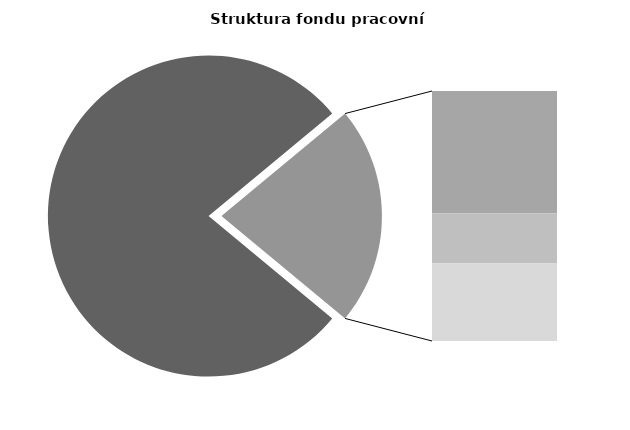
| Category | Series 0 |
|---|---|
| Průměrná měsíční odpracovaná doba bez přesčasu | 134.35 |
| Dovolená | 18.548 |
| Nemoc | 7.635 |
| Jiné | 11.759 |